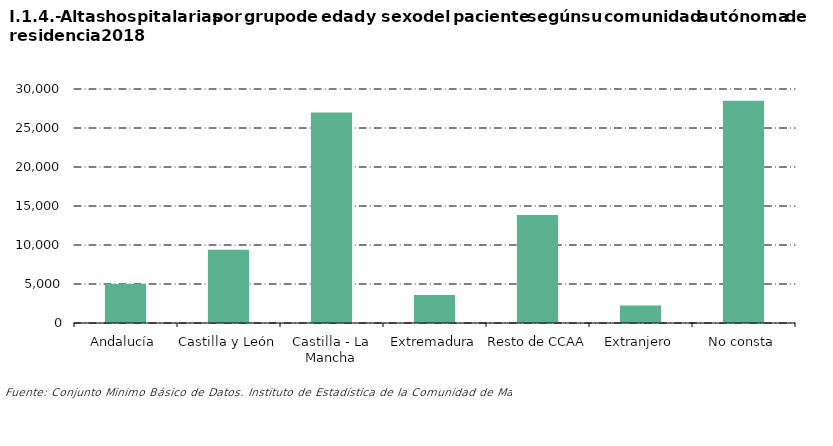
| Category | Series 1 |
|---|---|
| Andalucía | 4988 |
| Castilla y León | 9380 |
| Castilla - La Mancha | 26987 |
| Extremadura | 3592 |
| Resto de CCAA | 13852 |
| Extranjero | 2237 |
| No consta | 28507 |